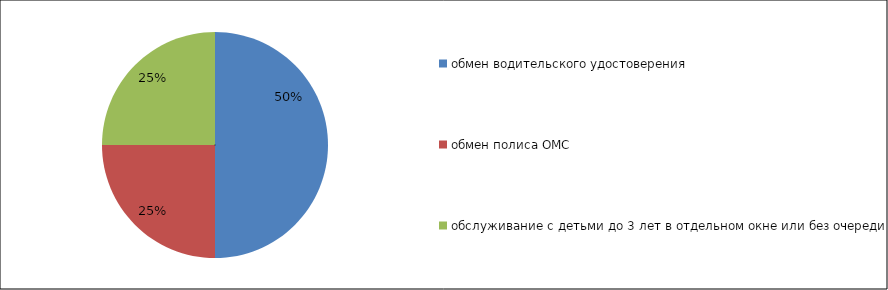
| Category | Series 0 | Series 1 |
|---|---|---|
| обмен водительского удостоверения | 2 | 32 |
| обмен полиса ОМС | 1 | 32 |
| обслуживание с детьми до 3 лет в отдельном окне или без очереди | 1 | 32 |